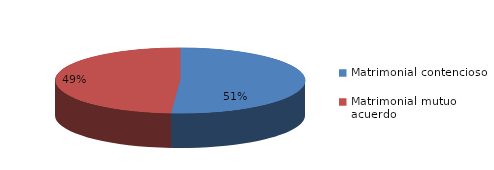
| Category | Series 0 |
|---|---|
| 0 | 136 |
| 1 | 130 |